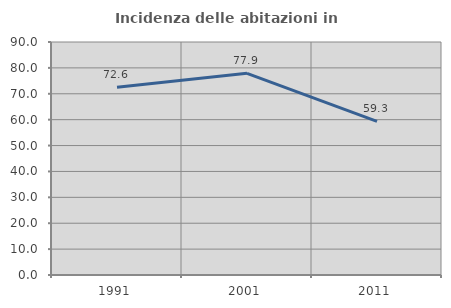
| Category | Incidenza delle abitazioni in proprietà  |
|---|---|
| 1991.0 | 72.553 |
| 2001.0 | 77.888 |
| 2011.0 | 59.339 |